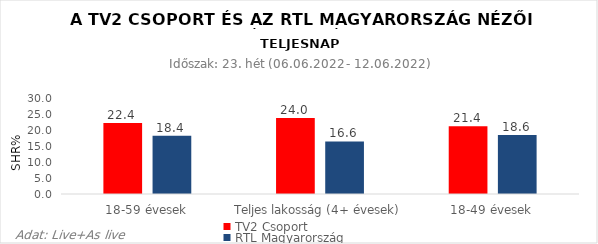
| Category | TV2 Csoport | RTL Magyarország |
|---|---|---|
| 18-59 évesek | 22.4 | 18.4 |
| Teljes lakosság (4+ évesek) | 24 | 16.6 |
| 18-49 évesek | 21.4 | 18.6 |